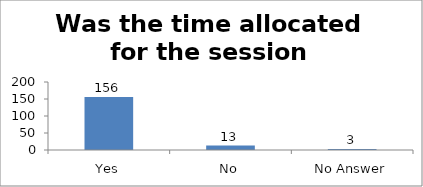
| Category | Was the time allocated for the session sufficient? |
|---|---|
| Yes | 156 |
| No | 13 |
| No Answer | 3 |